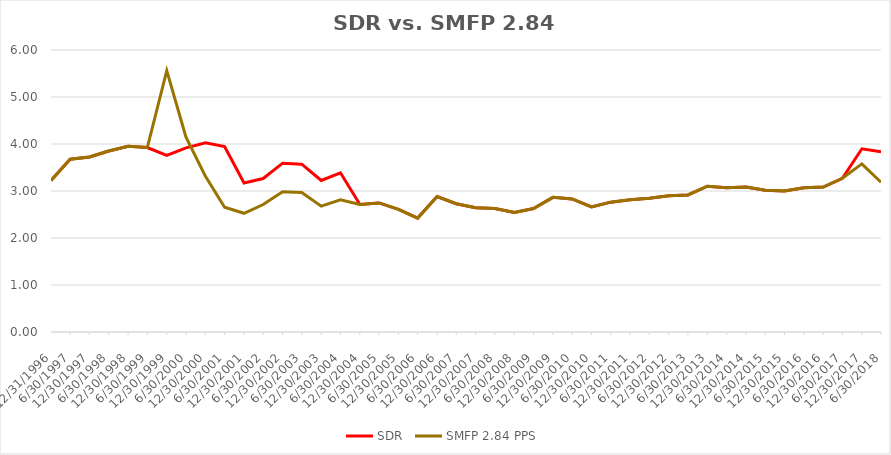
| Category | SDR | SMFP 2.84 PPS |
|---|---|---|
| 12/31/96 | 3.225 | 3.225 |
| 6/30/97 | 3.675 | 3.675 |
| 12/31/97 | 3.725 | 3.725 |
| 6/30/98 | 3.85 | 3.85 |
| 12/31/98 | 3.95 | 3.95 |
| 6/30/99 | 3.925 | 3.925 |
| 12/31/99 | 3.757 | 5.56 |
| 6/30/00 | 3.919 | 4.143 |
| 12/31/00 | 4.027 | 3.311 |
| 6/30/01 | 3.946 | 2.655 |
| 12/31/01 | 3.17 | 2.525 |
| 6/30/02 | 3.265 | 2.712 |
| 12/31/02 | 3.592 | 2.983 |
| 6/30/03 | 3.571 | 2.966 |
| 12/31/03 | 3.224 | 2.678 |
| 6/30/04 | 3.388 | 2.814 |
| 12/31/04 | 2.712 | 2.712 |
| 6/30/05 | 2.746 | 2.746 |
| 12/31/05 | 2.61 | 2.61 |
| 6/30/06 | 2.424 | 2.424 |
| 12/31/06 | 2.881 | 2.881 |
| 6/30/07 | 2.729 | 2.729 |
| 12/31/07 | 2.644 | 2.644 |
| 6/30/08 | 2.627 | 2.627 |
| 12/31/08 | 2.542 | 2.542 |
| 6/30/09 | 2.627 | 2.627 |
| 12/31/09 | 2.864 | 2.864 |
| 6/30/10 | 2.831 | 2.831 |
| 12/31/10 | 2.661 | 2.661 |
| 6/30/11 | 2.763 | 2.763 |
| 12/31/11 | 2.814 | 2.814 |
| 6/30/12 | 2.847 | 2.847 |
| 12/31/12 | 2.898 | 2.898 |
| 6/30/13 | 2.915 | 2.915 |
| 12/31/13 | 3.102 | 3.102 |
| 6/30/14 | 3.068 | 3.068 |
| 12/31/14 | 3.085 | 3.085 |
| 6/30/15 | 3.017 | 3.017 |
| 12/31/15 | 3 | 3 |
| 6/30/16 | 3.068 | 3.068 |
| 12/31/16 | 3.085 | 3.085 |
| 6/30/17 | 3.271 | 3.271 |
| 12/31/17 | 3.898 | 3.578 |
| 6/30/18 | 3.837 | 3.186 |